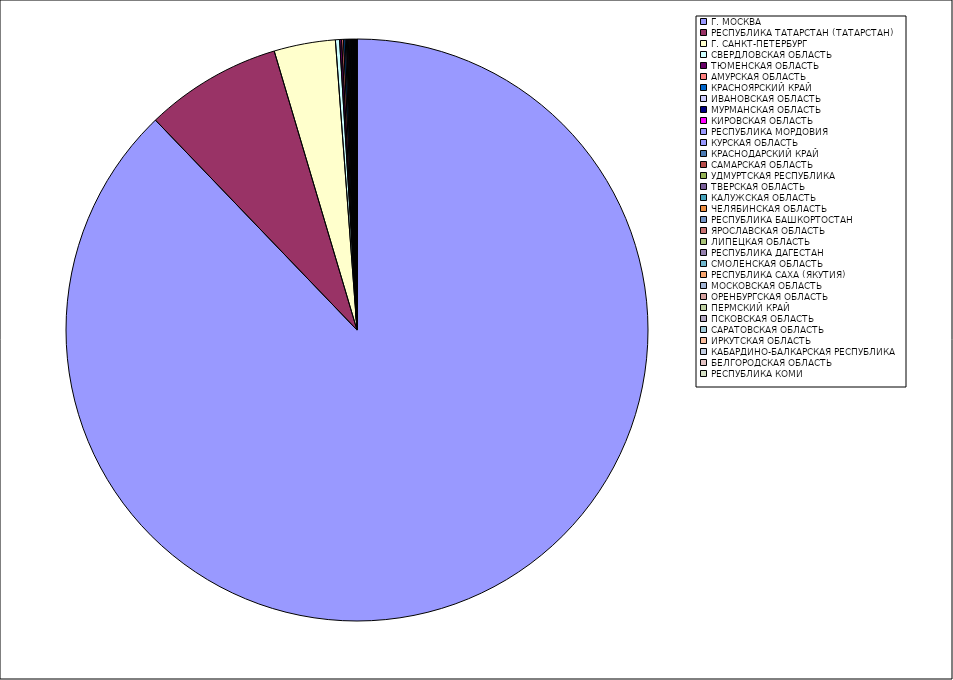
| Category | Оборот |
|---|---|
| Г. МОСКВА | 87.775 |
| РЕСПУБЛИКА ТАТАРСТАН (ТАТАРСТАН) | 7.583 |
| Г. САНКТ-ПЕТЕРБУРГ | 3.405 |
| СВЕРДЛОВСКАЯ ОБЛАСТЬ | 0.229 |
| ТЮМЕНСКАЯ ОБЛАСТЬ | 0.109 |
| АМУРСКАЯ ОБЛАСТЬ | 0.103 |
| КРАСНОЯРСКИЙ КРАЙ | 0.093 |
| ИВАНОВСКАЯ ОБЛАСТЬ | 0.064 |
| МУРМАНСКАЯ ОБЛАСТЬ | 0.056 |
| КИРОВСКАЯ ОБЛАСТЬ | 0.05 |
| РЕСПУБЛИКА МОРДОВИЯ | 0.046 |
| КУРСКАЯ ОБЛАСТЬ | 0.045 |
| КРАСНОДАРСКИЙ КРАЙ | 0.039 |
| САМАРСКАЯ ОБЛАСТЬ | 0.038 |
| УДМУРТСКАЯ РЕСПУБЛИКА | 0.036 |
| ТВЕРСКАЯ ОБЛАСТЬ | 0.034 |
| КАЛУЖСКАЯ ОБЛАСТЬ | 0.03 |
| ЧЕЛЯБИНСКАЯ ОБЛАСТЬ | 0.029 |
| РЕСПУБЛИКА БАШКОРТОСТАН | 0.027 |
| ЯРОСЛАВСКАЯ ОБЛАСТЬ | 0.023 |
| ЛИПЕЦКАЯ ОБЛАСТЬ | 0.023 |
| РЕСПУБЛИКА ДАГЕСТАН | 0.014 |
| СМОЛЕНСКАЯ ОБЛАСТЬ | 0.012 |
| РЕСПУБЛИКА САХА (ЯКУТИЯ) | 0.011 |
| МОСКОВСКАЯ ОБЛАСТЬ | 0.01 |
| ОРЕНБУРГСКАЯ ОБЛАСТЬ | 0.01 |
| ПЕРМСКИЙ КРАЙ | 0.009 |
| ПСКОВСКАЯ ОБЛАСТЬ | 0.009 |
| САРАТОВСКАЯ ОБЛАСТЬ | 0.008 |
| ИРКУТСКАЯ ОБЛАСТЬ | 0.008 |
| КАБАРДИНО-БАЛКАРСКАЯ РЕСПУБЛИКА | 0.008 |
| БЕЛГОРОДСКАЯ ОБЛАСТЬ | 0.006 |
| РЕСПУБЛИКА КОМИ | 0.005 |